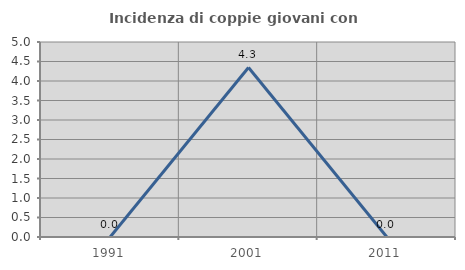
| Category | Incidenza di coppie giovani con figli |
|---|---|
| 1991.0 | 0 |
| 2001.0 | 4.348 |
| 2011.0 | 0 |